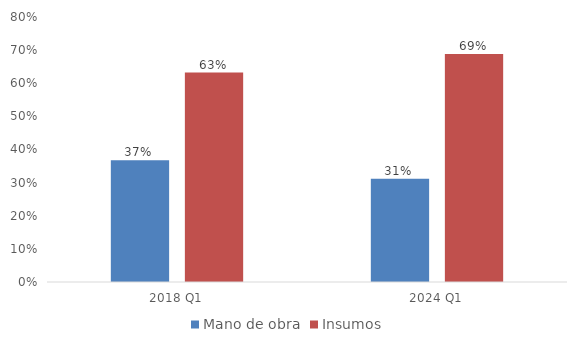
| Category | Mano de obra | Insumos |
|---|---|---|
| 2018 Q1 | 0.368 | 0.632 |
| 2024 Q1 | 0.312 | 0.688 |